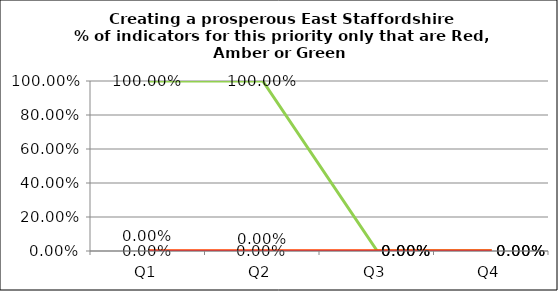
| Category | Green | Amber | Red |
|---|---|---|---|
| Q1 | 1 | 0 | 0 |
| Q2 | 1 | 0 | 0 |
| Q3 | 0 | 0 | 0 |
| Q4 | 0 | 0 | 0 |